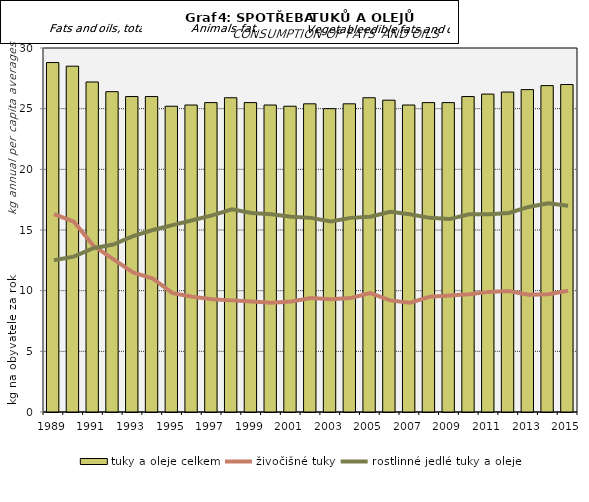
| Category | tuky a oleje celkem |
|---|---|
| 1989.0 | 28.8 |
| 1990.0 | 28.5 |
| 1991.0 | 27.2 |
| 1992.0 | 26.4 |
| 1993.0 | 26 |
| 1994.0 | 26 |
| 1995.0 | 25.2 |
| 1996.0 | 25.3 |
| 1997.0 | 25.5 |
| 1998.0 | 25.9 |
| 1999.0 | 25.5 |
| 2000.0 | 25.3 |
| 2001.0 | 25.2 |
| 2002.0 | 25.4 |
| 2003.0 | 25 |
| 2004.0 | 25.4 |
| 2005.0 | 25.9 |
| 2006.0 | 25.7 |
| 2007.0 | 25.3 |
| 2008.0 | 25.5 |
| 2009.0 | 25.5 |
| 2010.0 | 26 |
| 2011.0 | 26.2 |
| 2012.0 | 26.37 |
| 2013.0 | 26.57 |
| 2014.0 | 26.9 |
| 2015.0 | 26.99 |